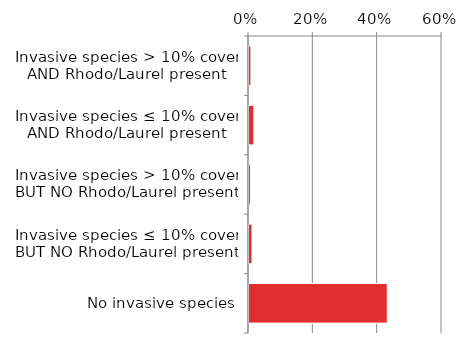
| Category | Native |
|---|---|
| No invasive species | 0.433 |
| Invasive species ≤ 10% cover BUT NO Rhodo/Laurel present | 0.012 |
| Invasive species > 10% cover BUT NO Rhodo/Laurel present | 0.008 |
| Invasive species ≤ 10% cover AND Rhodo/Laurel present | 0.018 |
| Invasive species > 10% cover AND Rhodo/Laurel present | 0.009 |